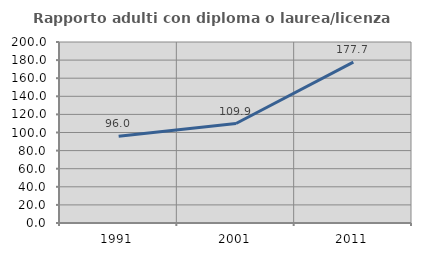
| Category | Rapporto adulti con diploma o laurea/licenza media  |
|---|---|
| 1991.0 | 95.964 |
| 2001.0 | 109.924 |
| 2011.0 | 177.684 |